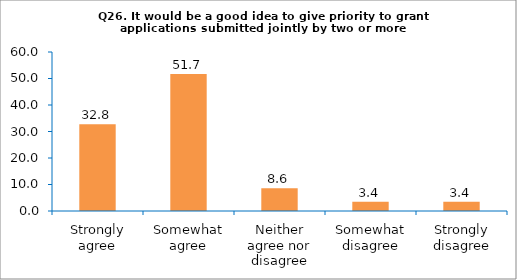
| Category | Series 0 |
|---|---|
| Strongly agree | 32.759 |
| Somewhat agree | 51.724 |
| Neither agree nor disagree | 8.621 |
| Somewhat disagree | 3.448 |
| Strongly disagree | 3.448 |